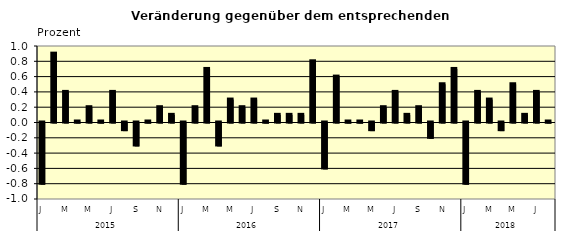
| Category | Series 0 |
|---|---|
| 0 | -0.8 |
| 1 | 0.9 |
| 2 | 0.4 |
| 3 | 0.01 |
| 4 | 0.2 |
| 5 | 0.01 |
| 6 | 0.4 |
| 7 | -0.1 |
| 8 | -0.3 |
| 9 | 0.01 |
| 10 | 0.2 |
| 11 | 0.1 |
| 12 | -0.8 |
| 13 | 0.2 |
| 14 | 0.7 |
| 15 | -0.3 |
| 16 | 0.3 |
| 17 | 0.2 |
| 18 | 0.3 |
| 19 | 0.01 |
| 20 | 0.1 |
| 21 | 0.1 |
| 22 | 0.1 |
| 23 | 0.8 |
| 24 | -0.6 |
| 25 | 0.6 |
| 26 | 0.01 |
| 27 | 0.01 |
| 28 | -0.1 |
| 29 | 0.2 |
| 30 | 0.4 |
| 31 | 0.1 |
| 32 | 0.2 |
| 33 | -0.2 |
| 34 | 0.5 |
| 35 | 0.7 |
| 36 | -0.8 |
| 37 | 0.4 |
| 38 | 0.3 |
| 39 | -0.1 |
| 40 | 0.5 |
| 41 | 0.1 |
| 42 | 0.4 |
| 43 | 0.01 |